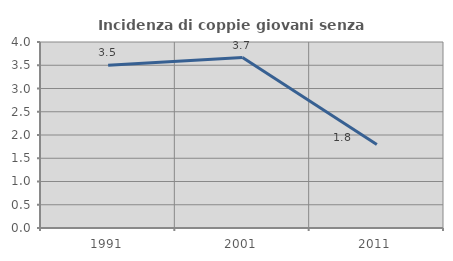
| Category | Incidenza di coppie giovani senza figli |
|---|---|
| 1991.0 | 3.497 |
| 2001.0 | 3.667 |
| 2011.0 | 1.795 |